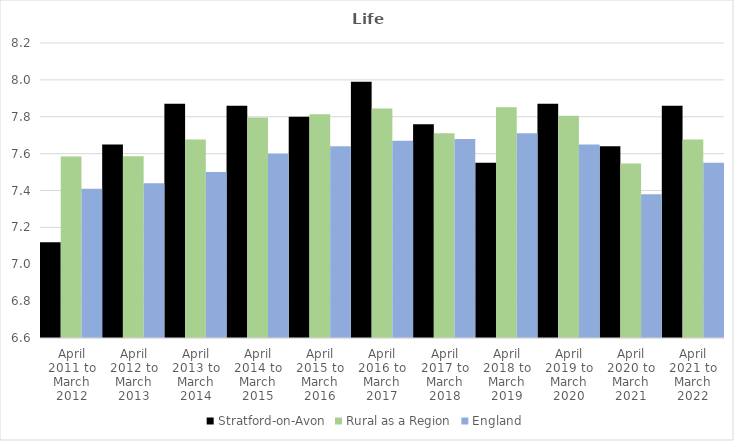
| Category | Stratford-on-Avon | Rural as a Region | England |
|---|---|---|---|
| April 2011 to March 2012 | 7.12 | 7.584 | 7.41 |
| April 2012 to March 2013 | 7.65 | 7.586 | 7.44 |
| April 2013 to March 2014 | 7.87 | 7.677 | 7.5 |
| April 2014 to March 2015 | 7.86 | 7.797 | 7.6 |
| April 2015 to March 2016 | 7.8 | 7.813 | 7.64 |
| April 2016 to March 2017 | 7.99 | 7.845 | 7.67 |
| April 2017 to March 2018 | 7.76 | 7.71 | 7.68 |
| April 2018 to March 2019 | 7.55 | 7.852 | 7.71 |
| April 2019 to March 2020 | 7.87 | 7.806 | 7.65 |
| April 2020 to March 2021 | 7.64 | 7.546 | 7.38 |
| April 2021 to March 2022 | 7.86 | 7.677 | 7.55 |